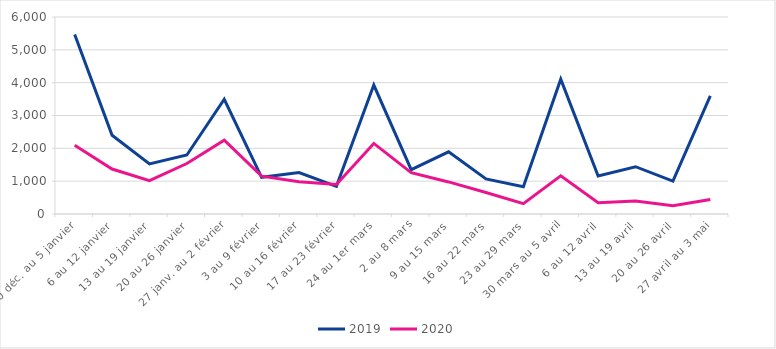
| Category | 2019 | 2020 |
|---|---|---|
| 30 déc. au 5 janvier | 5470 | 2097 |
| 6 au 12 janvier | 2400 | 1370 |
| 13 au 19 janvier | 1527 | 1015 |
| 20 au 26 janvier | 1798 | 1537 |
| 27 janv. au 2 février | 3495 | 2246 |
| 3 au 9 février | 1116 | 1152 |
| 10 au 16 février | 1260 | 981 |
| 17 au 23 février | 841 | 901 |
| 24 au 1er mars | 3928 | 2149 |
| 2 au 8 mars | 1349 | 1260 |
| 9 au 15 mars | 1893 | 977 |
| 16 au 22 mars | 1068 | 654 |
| 23 au 29 mars | 828 | 316 |
| 30 mars au 5 avril | 4105 | 1161 |
| 6 au 12 avril | 1156 | 344 |
| 13 au 19 avril | 1440 | 399 |
| 20 au 26 avril | 1002 | 253 |
| 27 avril au 3 mai | 3595 | 440 |